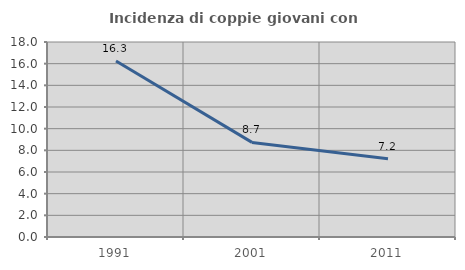
| Category | Incidenza di coppie giovani con figli |
|---|---|
| 1991.0 | 16.251 |
| 2001.0 | 8.733 |
| 2011.0 | 7.23 |